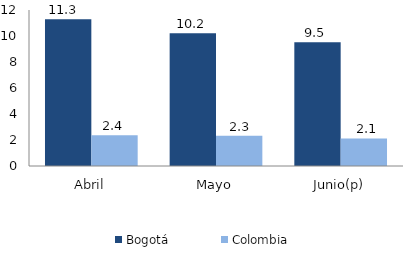
| Category | Bogotá | Colombia |
|---|---|---|
| Abril | 11.29 | 2.362 |
| Mayo | 10.213 | 2.33 |
| Junio(p) | 9.513 | 2.125 |